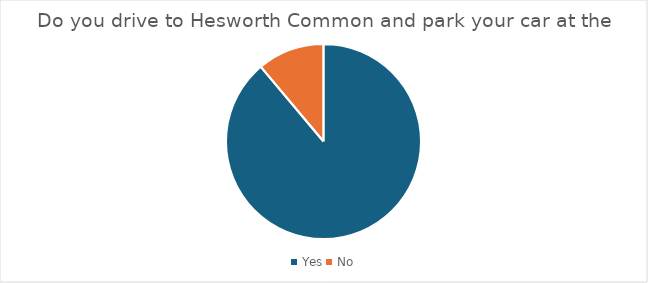
| Category | Series 0 |
|---|---|
| Yes | 16 |
| No | 2 |